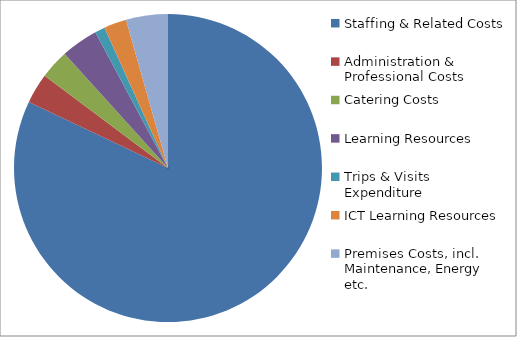
| Category | Series 0 |
|---|---|
| Staffing & Related Costs | 565072 |
| Administration & Professional Costs | 21733 |
| Catering Costs | 21195 |
| Learning Resources | 26807 |
| Trips & Visits Expenditure | 7291 |
| ICT Learning Resources | 16309 |
| Premises Costs, incl. Maintenance, Energy etc. | 30264 |